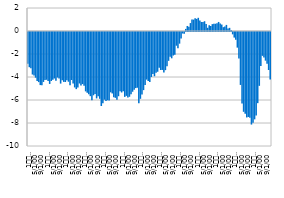
| Category | Fiscal result |
|---|---|
| 1
2009 | -2.771 |
| 2 | -3.062 |
| 3 | -3.158 |
| 4 | -3.697 |
| 5 | -3.784 |
| 6 | -3.975 |
| 7 | -4.262 |
| 8 | -4.357 |
| 9 | -4.616 |
| 10 | -4.64 |
| 11 | -4.343 |
| 12 | -4.166 |
| 1
2010 | -4.153 |
| 2 | -4.272 |
| 3 | -4.516 |
| 4 | -4.259 |
| 5 | -4.144 |
| 6 | -4.043 |
| 7 | -4.232 |
| 8 | -3.96 |
| 9 | -4.038 |
| 10 | -4.486 |
| 11 | -4.19 |
| 12 | -4.338 |
| 1
2011 | -4.348 |
| 2 | -4.191 |
| 3 | -4.324 |
| 4 | -4.628 |
| 5 | -4.174 |
| 6 | -4.474 |
| 7 | -4.819 |
| 8 | -4.967 |
| 9 | -4.819 |
| 10 | -4.477 |
| 11 | -4.653 |
| 12 | -4.526 |
| 1
2012 | -4.676 |
| 2 | -5.162 |
| 3 | -5.288 |
| 4 | -5.424 |
| 5 | -5.579 |
| 6 | -5.934 |
| 7 | -5.504 |
| 8 | -5.386 |
| 9 | -5.775 |
| 10 | -5.588 |
| 11 | -5.808 |
| 12 | -6.435 |
| 1
2013 | -6.189 |
| 2 | -5.885 |
| 3 | -5.989 |
| 4 | -5.937 |
| 5 | -5.946 |
| 6 | -5.247 |
| 7 | -5.345 |
| 8 | -5.672 |
| 9 | -5.724 |
| 10 | -5.902 |
| 11 | -5.585 |
| 12 | -5.146 |
| 1
2014 | -5.259 |
| 2 | -5.162 |
| 3 | -5.642 |
| 4 | -5.552 |
| 5 | -5.696 |
| 6 | -5.632 |
| 7 | -5.406 |
| 8 | -5.194 |
| 9 | -5.012 |
| 10 | -4.876 |
| 11 | -4.846 |
| 12 | -6.204 |
| 1
2015 | -5.81 |
| 2 | -5.441 |
| 3 | -5.054 |
| 4 | -4.613 |
| 5 | -4.137 |
| 6 | -4.271 |
| 7 | -4.353 |
| 8 | -3.91 |
| 9 | -3.662 |
| 10 | -3.849 |
| 11 | -3.554 |
| 12 | -3.456 |
| 1
2016 | -3.118 |
| 2 | -3.307 |
| 3 | -3.298 |
| 4 | -3.529 |
| 5 | -3.318 |
| 6 | -2.989 |
| 7 | -2.508 |
| 8 | -2.146 |
| 9 | -2.288 |
| 10 | -2.046 |
| 11 | -1.98 |
| 12 | -1.193 |
| 1
2017 | -1.41 |
| 2 | -1.013 |
| 3 | -0.572 |
| 4 | -0.129 |
| 5 | -0.143 |
| 6 | 0.181 |
| 7 | 0.438 |
| 8 | 0.366 |
| 9 | 0.689 |
| 10 | 0.996 |
| 11 | 0.99 |
| 12 | 1.099 |
| 1
2018 | 1.053 |
| 2 | 1.148 |
| 3 | 0.914 |
| 4 | 0.786 |
| 5 | 0.792 |
| 6 | 0.85 |
| 7 | 0.612 |
| 8 | 0.28 |
| 9 | 0.508 |
| 10 | 0.434 |
| 11 | 0.597 |
| 12 | 0.635 |
| 1
2019 | 0.63 |
| 2 | 0.667 |
| 3 | 0.788 |
| 4 | 0.662 |
| 5 | 0.562 |
| 6 | 0.332 |
| 7 | 0.382 |
| 8 | 0.531 |
| 9 | 0.228 |
| 10 | 0.275 |
| 11 | 0.077 |
| 12 | -0.205 |
| 1
2020 | -0.485 |
| 2 | -0.683 |
| 3 | -1.36 |
| 4 | -2.294 |
| 5 | -4.604 |
| 6 | -6.219 |
| 7 | -6.939 |
| 8 | -7.106 |
| 9 | -7.43 |
| 10 | -7.388 |
| 11 | -7.461 |
| 12 | -8.047 |
| 1
2021 | -7.895 |
| 2 | -7.596 |
| 3 | -7.261 |
| 4 | -6.187 |
| 5 | -4.681 |
| 6 | -2.952 |
| 7 | -2.073 |
| 8 | -2.223 |
| 9 | -2.492 |
| 10 | -2.759 |
| 11 | -3.307 |
| 12 | -4.138 |